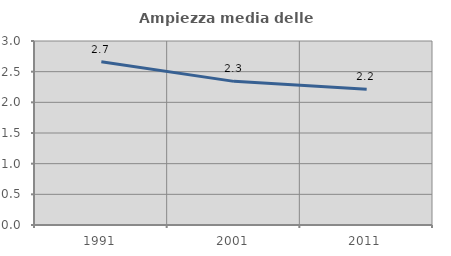
| Category | Ampiezza media delle famiglie |
|---|---|
| 1991.0 | 2.66 |
| 2001.0 | 2.342 |
| 2011.0 | 2.213 |